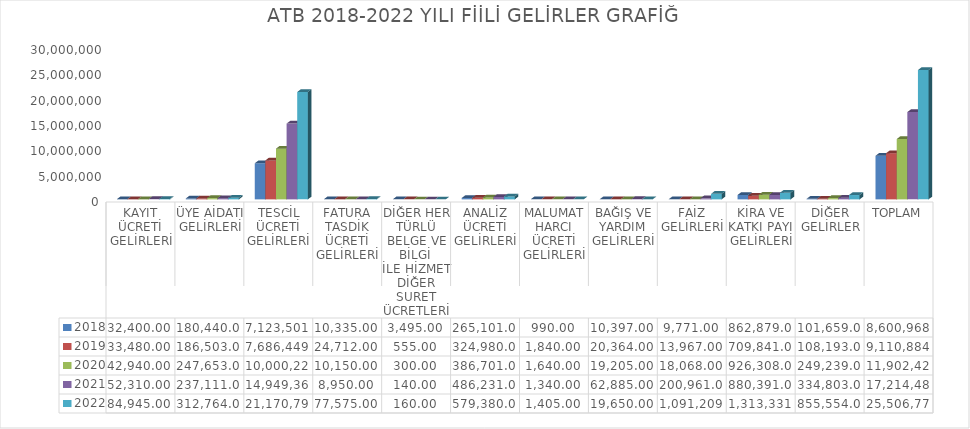
| Category | 2018 | 2019 | 2020 | 2021 | 2022 |
|---|---|---|---|---|---|
| KAYIT ÜCRETİ GELİRLERİ | 32400 | 33480 | 42940 | 52310 | 84945 |
| ÜYE AİDATI GELİRLERİ | 180440 | 186503 | 247653 | 237111 | 312764 |
| TESCİL ÜCRETİ GELİRLERİ | 7123501 | 7686449 | 10000221 | 14949366 | 21170799 |
| FATURA TASDİK ÜCRETİ GELİRLERİ | 10335 | 24712 | 10150 | 8950 | 77575 |
| DİĞER HER TÜRLÜ BELGE VE BİLGİ 
İLE HİZMET DİĞER SURET ÜCRETLERİ | 3495 | 555 | 300 | 140 | 160 |
| ANALİZ ÜCRETİ GELİRLERİ | 265101 | 324980 | 386701 | 486231 | 579380 |
| MALUMAT HARCI ÜCRETİ GELİRLERİ | 990 | 1840 | 1640 | 1340 | 1405 |
| BAĞIŞ VE YARDIM GELİRLERİ | 10397 | 20364 | 19205 | 62885 | 19650 |
| FAİZ GELİRLERİ | 9771 | 13967 | 18068 | 200961 | 1091209 |
| KİRA VE KATKI PAYI GELİRLERİ | 862879 | 709841 | 926308 | 880391 | 1313331 |
| DİĞER GELİRLER | 101659 | 108193 | 249239 | 334803 | 855554 |
| TOPLAM | 8600968 | 9110884 | 11902425 | 17214488 | 25506772 |